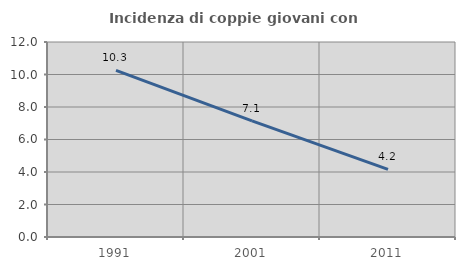
| Category | Incidenza di coppie giovani con figli |
|---|---|
| 1991.0 | 10.256 |
| 2001.0 | 7.143 |
| 2011.0 | 4.167 |